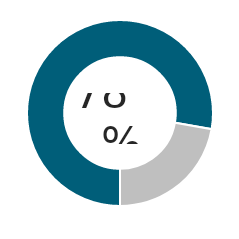
| Category | Series 0 |
|---|---|
| 0 | 0.778 |
| 1 | 0.222 |